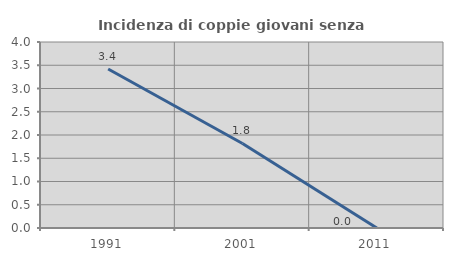
| Category | Incidenza di coppie giovani senza figli |
|---|---|
| 1991.0 | 3.419 |
| 2001.0 | 1.818 |
| 2011.0 | 0 |